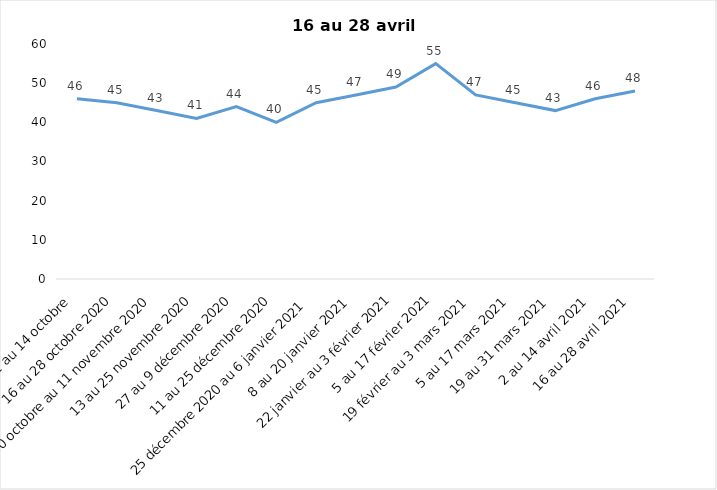
| Category | Toujours aux trois mesures |
|---|---|
| 2 au 14 octobre  | 46 |
| 16 au 28 octobre 2020 | 45 |
| 30 octobre au 11 novembre 2020 | 43 |
| 13 au 25 novembre 2020 | 41 |
| 27 au 9 décembre 2020 | 44 |
| 11 au 25 décembre 2020 | 40 |
| 25 décembre 2020 au 6 janvier 2021 | 45 |
| 8 au 20 janvier 2021 | 47 |
| 22 janvier au 3 février 2021 | 49 |
| 5 au 17 février 2021 | 55 |
| 19 février au 3 mars 2021 | 47 |
| 5 au 17 mars 2021 | 45 |
| 19 au 31 mars 2021 | 43 |
| 2 au 14 avril 2021 | 46 |
| 16 au 28 avril 2021 | 48 |